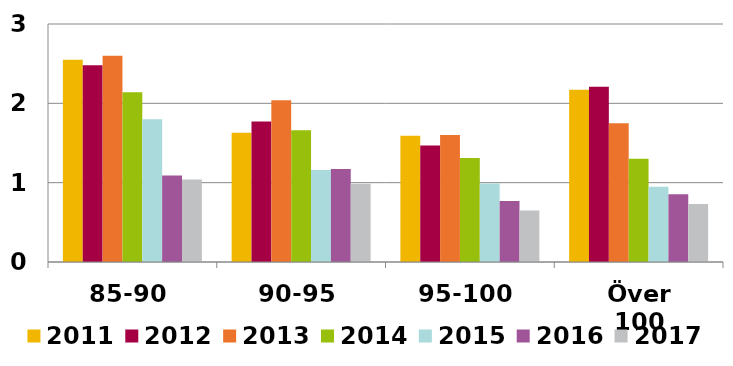
| Category | 2011 | 2012 | 2013 | 2014 | 2015 | 2016 | 2017 |
|---|---|---|---|---|---|---|---|
| 85-90 | 2.55 | 2.48 | 2.6 | 2.14 | 1.8 | 1.091 | 1.039 |
| 90-95 | 1.63 | 1.77 | 2.04 | 1.66 | 1.16 | 1.173 | 0.985 |
| 95-100 | 1.59 | 1.47 | 1.6 | 1.31 | 0.99 | 0.769 | 0.651 |
| Över 100 | 2.17 | 2.21 | 1.75 | 1.3 | 0.95 | 0.854 | 0.73 |